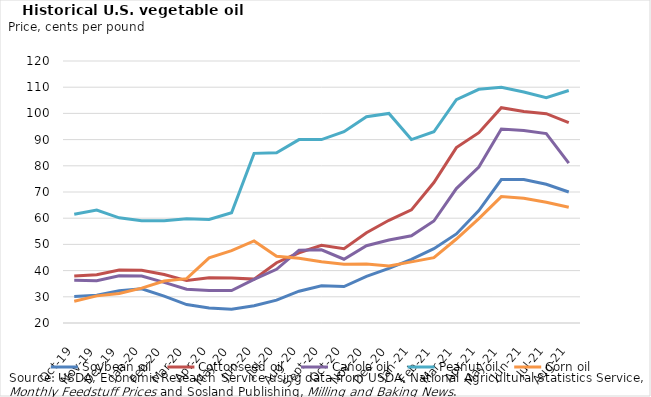
| Category | Soybean oil | Cottonseed oil | Canola oil | Peanut oil | Corn oil |
|---|---|---|---|---|---|
| 2019-10-01 | 30.14 | 37.94 | 36.31 | 61.5 | 28.3 |
| 2019-11-01 | 30.62 | 38.4 | 36.15 | 63.1 | 30.36 |
| 2019-12-01 | 32.27 | 40.25 | 38.06 | 60.13 | 31.25 |
| 2020-01-01 | 33.04 | 40.1 | 37.9 | 59 | 33.3 |
| 2020-02-01 | 30.26 | 38.5 | 35.5 | 59 | 36 |
| 2020-03-01 | 27.04 | 36.19 | 32.88 | 59.75 | 36.94 |
| 2020-04-01 | 25.69 | 37.31 | 32.38 | 59.5 | 44.88 |
| 2020-05-01 | 25.27 | 37.2 | 32.4 | 62.1 | 47.64 |
| 2020-06-01 | 26.61 | 36.75 | 36.63 | 84.75 | 51.34 |
| 2020-07-01 | 28.71 | 43 | 40.5 | 85 | 45.45 |
| 2020-08-01 | 32.13 | 46.81 | 47.81 | 90 | 44.75 |
| 2020-09-01 | 34.2 | 49.69 | 47.94 | 90 | 43.38 |
| 2020-10-01 | 33.91 | 48.35 | 44.35 | 93 | 42.438 |
| 2020-11-01 | 37.79 | 54.438 | 49.5 | 98.75 | 42.525 |
| 2020-12-01 | 40.85 | 59.2 | 51.65 | 100 | 41.725 |
| 2021-01-01 | 44.31 | 63.188 | 53.312 | 90 | 43.338 |
| 2021-02-01 | 48.37 | 73.625 | 58.938 | 93 | 44.945 |
| 2021-03-01 | 54 | 86.938 | 71.312 | 105.25 | 52.05 |
| 2021-04-01 | 62.88 | 92.65 | 79.55 | 109.2 | 59.812 |
| 2021-05-01 | 74.75 | 102.188 | 94.062 | 110 | 68.25 |
| 2021-06-01 | 74.75 | 100.688 | 93.5 | 108.188 | 67.6 |
| 2021-07-01 | 72.93 | 99.9 | 92.3 | 106 | 66.095 |
| 2021-08-01 | 70.01 | 96.5 | 81 | 108.75 | 64.156 |